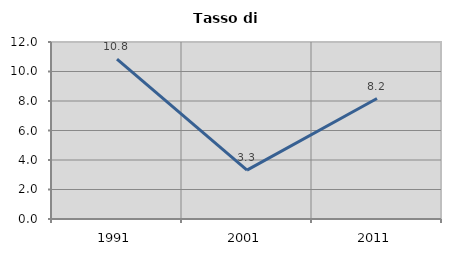
| Category | Tasso di disoccupazione   |
|---|---|
| 1991.0 | 10.843 |
| 2001.0 | 3.316 |
| 2011.0 | 8.168 |